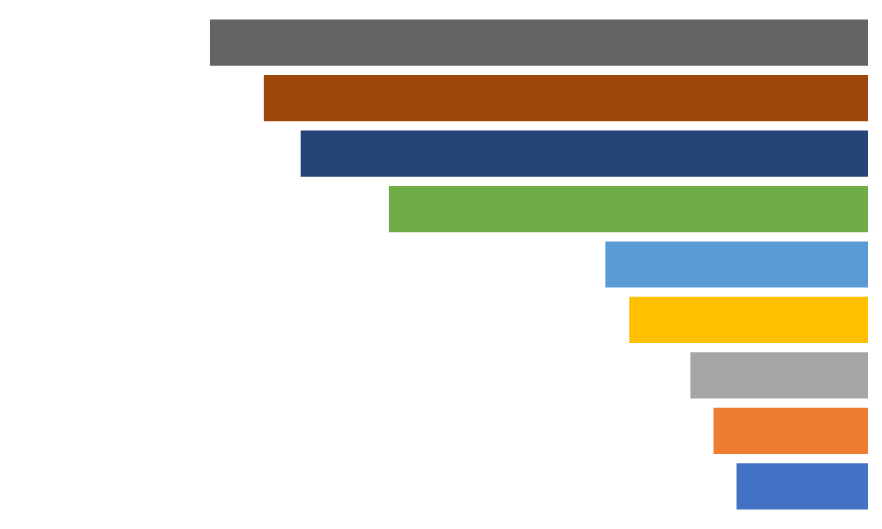
| Category | SALES FORECAST |
|---|---|
| Analysis | -38284 |
| First Contact | -45025 |
| Negotiations | -51821 |
| First Interview | -69758 |
| Final Commitment | -76787 |
| Pre-Approach | -140291 |
| Development | -166174 |
| Follow-Up | -176982 |
| Proposed Commitment  | -192792 |